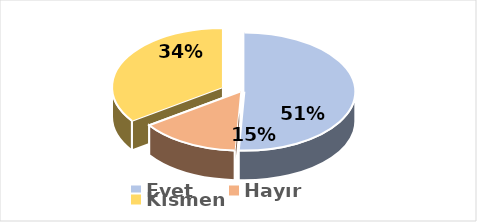
| Category | Evet |
|---|---|
| Evet | 0.508 |
| Hayır | 0.145 |
| Kısmen | 0.347 |